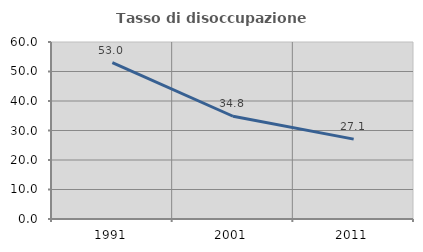
| Category | Tasso di disoccupazione giovanile  |
|---|---|
| 1991.0 | 52.977 |
| 2001.0 | 34.831 |
| 2011.0 | 27.083 |